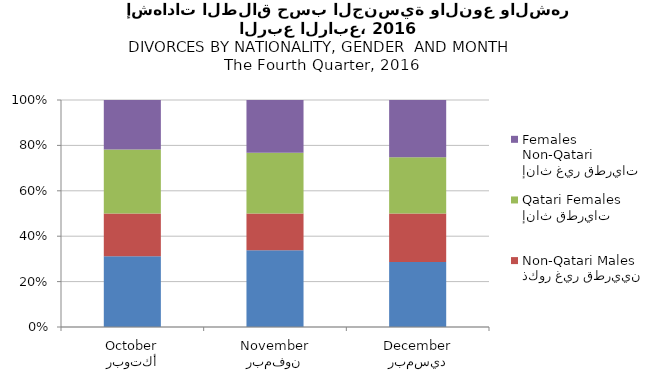
| Category | ذكور قطريون
Qatari Males | ذكور غير قطريين
Non-Qatari Males | إناث قطريات
Qatari Females | إناث غير قطريات
Non-Qatari Females |
|---|---|---|---|---|
| أكتوبر
October | 83 | 50 | 75 | 58 |
| نوفمبر
November | 67 | 32 | 53 | 46 |
| ديسمبر
December | 67 | 50 | 58 | 59 |